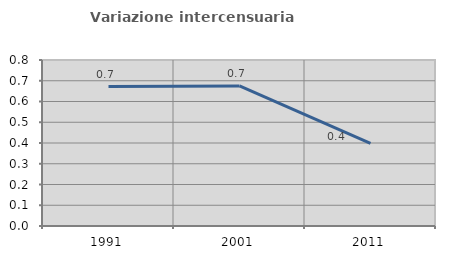
| Category | Variazione intercensuaria annua |
|---|---|
| 1991.0 | 0.672 |
| 2001.0 | 0.675 |
| 2011.0 | 0.398 |